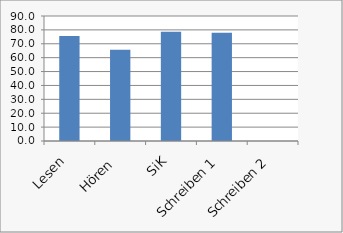
| Category | Ergebnis in % |
|---|---|
| Lesen | 75.521 |
| Hören  | 65.625 |
| SiK | 78.667 |
| Schreiben 1 | 77.917 |
| Schreiben 2 | 0 |